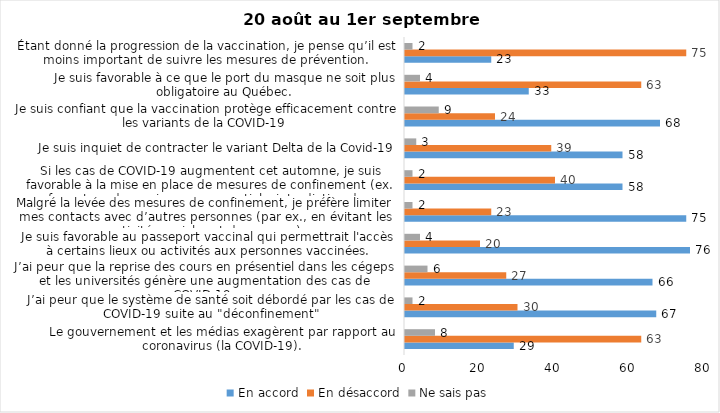
| Category | En accord | En désaccord | Ne sais pas |
|---|---|---|---|
| Le gouvernement et les médias exagèrent par rapport au coronavirus (la COVID-19). | 29 | 63 | 8 |
| J’ai peur que le système de santé soit débordé par les cas de COVID-19 suite au "déconfinement" | 67 | 30 | 2 |
| J’ai peur que la reprise des cours en présentiel dans les cégeps et les universités génère une augmentation des cas de COVID-19. | 66 | 27 | 6 |
| Je suis favorable au passeport vaccinal qui permettrait l'accès à certains lieux ou activités aux personnes vaccinées. | 76 | 20 | 4 |
| Malgré la levée des mesures de confinement, je préfère limiter mes contacts avec d’autres personnes (par ex., en évitant les activités sociales et de groupes) | 75 | 23 | 2 |
| Si les cas de COVID-19 augmentent cet automne, je suis favorable à la mise en place de mesures de confinement (ex. fermeture de services non essentiels, interdiction des rassemblements privés) | 58 | 40 | 2 |
| Je suis inquiet de contracter le variant Delta de la Covid-19 | 58 | 39 | 3 |
| Je suis confiant que la vaccination protège efficacement contre les variants de la COVID-19 | 68 | 24 | 9 |
| Je suis favorable à ce que le port du masque ne soit plus obligatoire au Québec. | 33 | 63 | 4 |
| Étant donné la progression de la vaccination, je pense qu’il est moins important de suivre les mesures de prévention. | 23 | 75 | 2 |